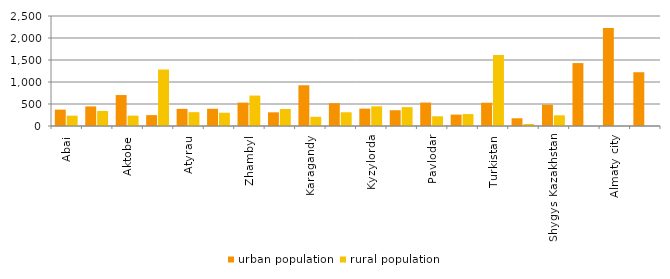
| Category | urban population | rural population |
|---|---|---|
| Abai | 372.556 | 235.033 |
| Akmola | 445.712 | 342.264 |
| Aktobe | 703.67 | 235.735 |
| Almaty | 247.519 | 1283.648 |
| Atyrau | 389.872 | 314.202 |
| Batys Kazakhstan | 391.734 | 301.527 |
| Zhambyl | 530.816 | 691.777 |
| Zhetisu | 311.135 | 386.852 |
| Karagandy | 926.202 | 209.149 |
| Kostanai | 517.698 | 312.286 |
| Kyzylorda | 395.163 | 446.766 |
| Mangystau | 358.231 | 428.606 |
| Pavlodar | 533.211 | 220.722 |
| Soltustik Kazakhstan | 259.34 | 270.749 |
| Turkistan | 528.101 | 1614.071 |
| Ulytau | 175.425 | 46.157 |
| Shygys Kazakhstan | 483.947 | 243.106 |
| Astana city | 1430.117 | 0 |
| Almaty city | 2228.677 | 0 |
| Shymkent city | 1222.066 | 0 |